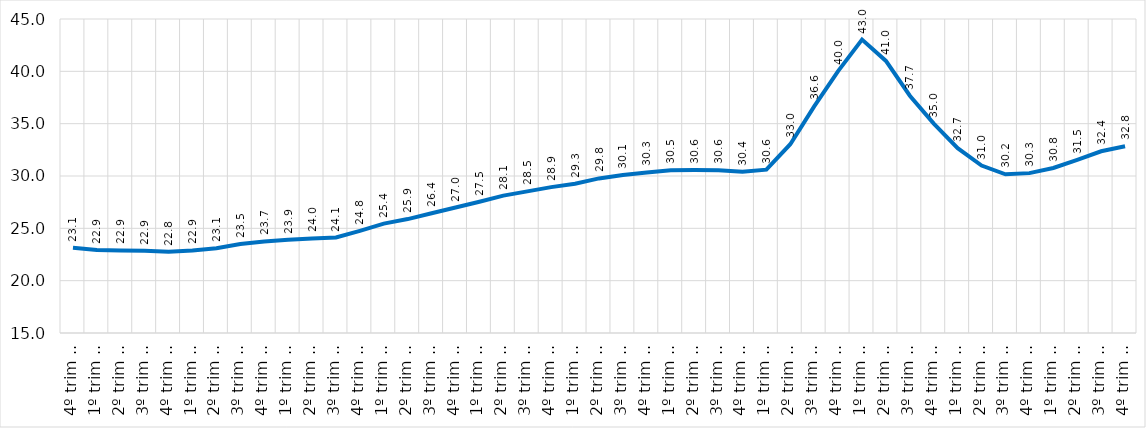
| Category | Series 0 |
|---|---|
| 4º trim / 2012 | 23.138 |
| 1º trim / 2013 | 22.931 |
| 2º trim / 2013 | 22.887 |
| 3º trim / 2013 | 22.869 |
| 4º trim / 2013 | 22.77 |
| 1º trim / 2014 | 22.886 |
| 2º trim / 2014 | 23.105 |
| 3º trim / 2014 | 23.508 |
| 4º trim / 2014 | 23.748 |
| 1º trim / 2015 | 23.904 |
| 2º trim / 2015 | 24.038 |
| 3º trim / 2015 | 24.122 |
| 4º trim / 2015 | 24.76 |
| 1º trim / 2016 | 25.448 |
| 2º trim / 2016 | 25.884 |
| 3º trim / 2016 | 26.444 |
| 4º trim / 2016 | 26.984 |
| 1º trim / 2017 | 27.542 |
| 2º trim / 2017 | 28.124 |
| 3º trim / 2017 | 28.532 |
| 4º trim / 2017 | 28.938 |
| 1º trim / 2018 | 29.254 |
| 2º trim / 2018 | 29.77 |
| 3º trim / 2018 | 30.104 |
| 4º trim / 2018 | 30.345 |
| 1º trim / 2019 | 30.541 |
| 2º trim / 2019 | 30.564 |
| 3º trim / 2019 | 30.554 |
| 4º trim / 2019 | 30.416 |
| 1º trim / 2020 | 30.606 |
| 2º trim / 2020 | 33.035 |
| 3º trim / 2020 | 36.648 |
| 4º trim / 2020 | 40.018 |
| 1º trim / 2021 | 43.03 |
| 2º trim / 2021 | 40.992 |
| 3º trim / 2021 | 37.669 |
| 4º trim / 2021 | 35.009 |
| 1º trim / 2022 | 32.66 |
| 2º trim / 2022 | 30.998 |
| 3º trim / 2022 | 30.164 |
| 4º trim / 2022 | 30.274 |
| 1º trim / 2023 | 30.767 |
| 2º trim / 2023 | 31.537 |
| 3º trim / 2023 | 32.364 |
| 4º trim / 2023 | 32.839 |